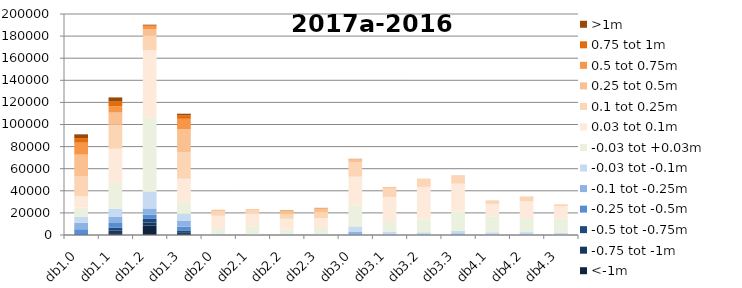
| Category | <-1m | -0.75 tot -1m | -0.5 tot -0.75m | -0.25 tot -0.5m | -0.1 tot -0.25m | -0.03 tot -0.1m | -0.03 tot +0.03m | 0.03 tot 0.1m | 0.1 tot 0.25m | 0.25 tot 0.5m | 0.5 tot 0.75m | 0.75 tot 1m | >1m |
|---|---|---|---|---|---|---|---|---|---|---|---|---|---|
| db1.0 | 1 | 14 | 694 | 4497 | 5763 | 5658 | 8299 | 10056 | 18096 | 19636 | 10811 | 4161 | 3431 |
| db1.1 | 1689 | 2192 | 2834 | 4124 | 5531 | 7277 | 23548 | 30863 | 21778 | 10999 | 5786 | 4151 | 3741 |
| db1.2 | 8483 | 2884 | 3213 | 3989 | 5460 | 15127 | 67428 | 60631 | 13338 | 5662 | 2916 | 720 | 474 |
| db1.3 | 935 | 993 | 2214 | 3354 | 5262 | 6382 | 9916 | 21860 | 23968 | 20905 | 9342 | 3240 | 1369 |
| db2.0 | 34 | 33 | 38 | 125 | 346 | 573 | 4344 | 11879 | 4023 | 1257 | 93 | 12 | 5 |
| db2.1 | 0 | 2 | 2 | 15 | 78 | 366 | 7185 | 11916 | 2790 | 941 | 46 | 0 | 0 |
| db2.2 | 0 | 1 | 10 | 179 | 322 | 454 | 3786 | 9989 | 4358 | 2310 | 895 | 155 | 15 |
| db2.3 | 18 | 17 | 28 | 58 | 231 | 551 | 5394 | 9091 | 5444 | 2923 | 607 | 87 | 102 |
| db3.0 | 35 | 26 | 73 | 483 | 2495 | 4626 | 19009 | 26089 | 13200 | 2434 | 197 | 56 | 175 |
| db3.1 | 1 | 3 | 19 | 196 | 893 | 1934 | 9666 | 21706 | 8146 | 754 | 63 | 17 | 27 |
| db3.2 | 3 | 5 | 7 | 148 | 708 | 1573 | 11676 | 29481 | 6849 | 452 | 29 | 11 | 2 |
| db3.3 | 10 | 24 | 83 | 315 | 1063 | 2154 | 17383 | 25428 | 6622 | 722 | 90 | 18 | 8 |
| db4.1 | 0 | 1 | 19 | 119 | 580 | 1714 | 14442 | 11274 | 2751 | 349 | 6 | 2 | 0 |
| db4.2 | 0 | 1 | 12 | 115 | 733 | 1751 | 12603 | 15358 | 3725 | 466 | 23 | 5 | 1 |
| db4.3 | 3 | 4 | 12 | 98 | 371 | 1600 | 12734 | 11294 | 1549 | 147 | 9 | 3 | 1 |